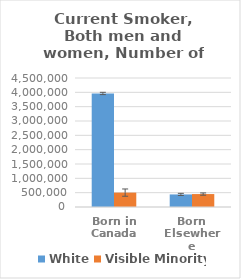
| Category | White | Visible Minority |
|---|---|---|
| Born in Canada | 3960401 | 501981 |
| Born Elsewhere | 438592 | 451301 |